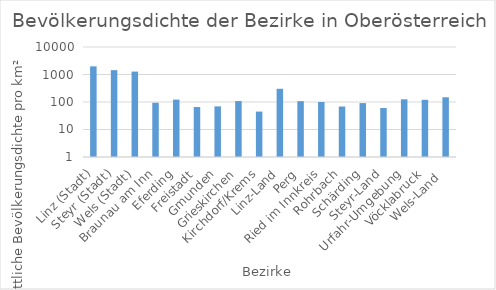
| Category | Bevölkerungsdichte |
|---|---|
| Linz (Stadt) | 1978.423 |
| Steyr (Stadt) | 1438.441 |
| Wels (Stadt) | 1275.936 |
| Braunau am Inn | 94.029 |
| Eferding | 122.335 |
| Freistadt | 65.515 |
| Gmunden | 69.385 |
| Grieskirchen | 108.042 |
| Kirchdorf/Krems | 44.812 |
| Linz-Land | 302.262 |
| Perg | 107.149 |
| Ried im Innkreis | 100.089 |
| Rohrbach | 68.468 |
| Schärding | 91.232 |
| Steyr-Land | 60.41 |
| Urfahr-Umgebung | 125.36 |
| Vöcklabruck | 120.189 |
| Wels-Land  | 148.462 |